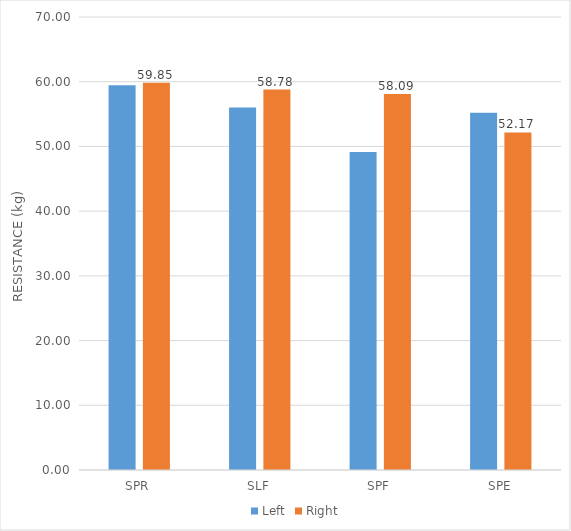
| Category | Left | Right |
|---|---|---|
| SPR | 59.44 | 59.85 |
| SLF | 56.01 | 58.78 |
| SPF | 49.12 | 58.09 |
| SPE | 55.19 | 52.17 |